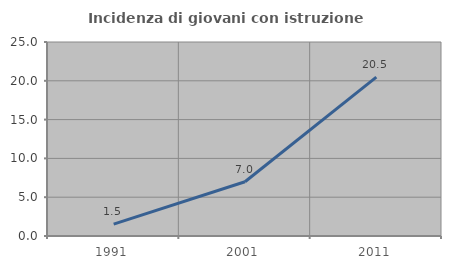
| Category | Incidenza di giovani con istruzione universitaria |
|---|---|
| 1991.0 | 1.534 |
| 2001.0 | 6.985 |
| 2011.0 | 20.474 |